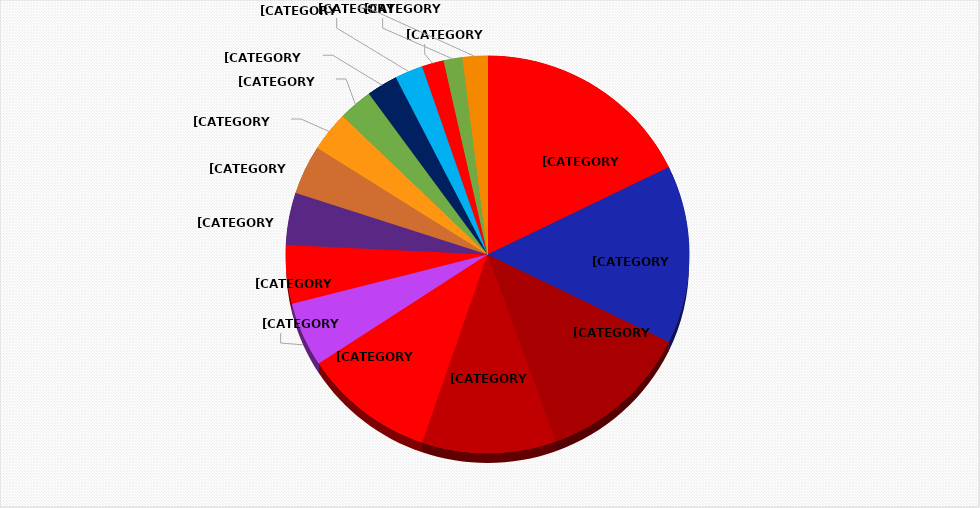
| Category | Series 0 |
|---|---|
| Georgia 71% | 71 |
| Michigan 58% | 58 |
| Florida State 49% | 49 |
| USC 43%  | 43 |
| Ohio State 42% | 42 |
| LSU 21% | 21 |
| Alabama 19% | 19 |
| Washington 17% | 17 |
| Texas 16% | 16 |
| Clemson 13% | 13 |
| Notre Dame 11% | 11 |
| Penn State 10% | 10 |
| North Carolina 9% | 9 |
| Oklahoma 7% | 7 |
| Oregon 6% | 6 |
| Others 8% | 8 |